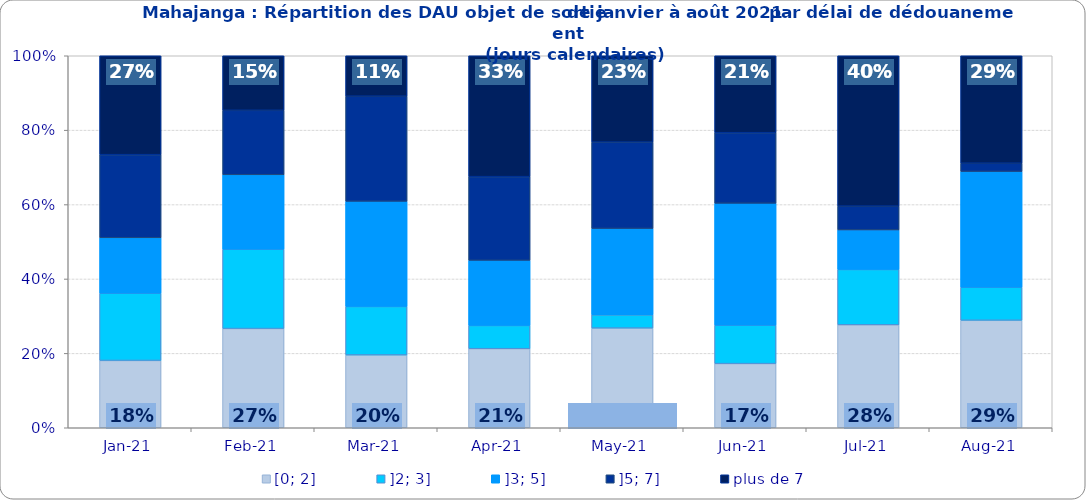
| Category | [0; 2] | ]2; 3] | ]3; 5] | ]5; 7] | plus de 7 |
|---|---|---|---|---|---|
| 2021-01-01 | 0.181 | 0.181 | 0.149 | 0.223 | 0.266 |
| 2021-02-01 | 0.267 | 0.213 | 0.2 | 0.173 | 0.147 |
| 2021-03-01 | 0.196 | 0.13 | 0.283 | 0.283 | 0.109 |
| 2021-04-01 | 0.212 | 0.062 | 0.175 | 0.225 | 0.325 |
| 2021-05-01 | 0.268 | 0.036 | 0.232 | 0.232 | 0.232 |
| 2021-06-01 | 0.172 | 0.103 | 0.328 | 0.19 | 0.207 |
| 2021-07-01 | 0.277 | 0.149 | 0.106 | 0.064 | 0.404 |
| 2021-08-01 | 0.289 | 0.089 | 0.311 | 0.022 | 0.289 |